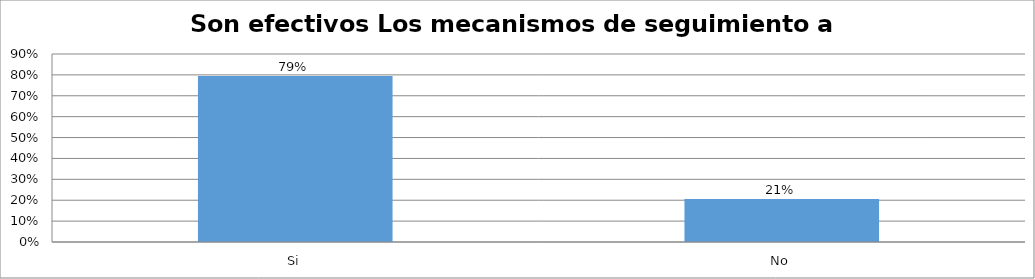
| Category | Series 0 |
|---|---|
| Si | 0.794 |
| No | 0.206 |